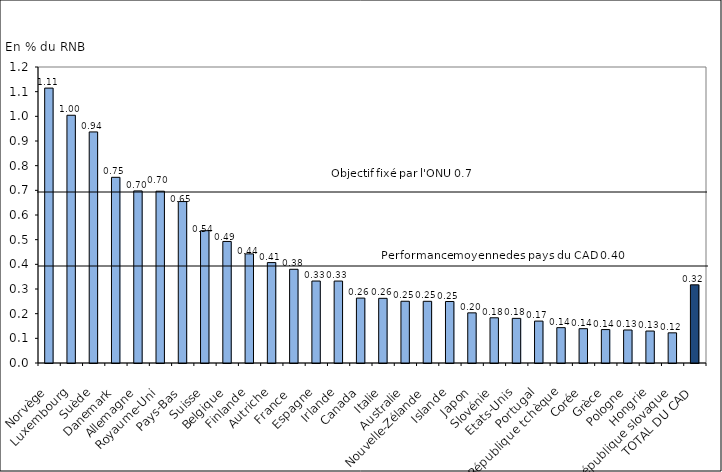
| Category | Series 0 |
|---|---|
| Norvège | 1.114 |
| Luxembourg | 1.004 |
| Suède | 0.937 |
| Danemark | 0.753 |
| Allemagne | 0.698 |
| Royaume-Uni | 0.696 |
| Pays-Bas | 0.654 |
| Suisse | 0.536 |
| Belgique | 0.493 |
| Finlande | 0.442 |
| Autriche | 0.407 |
| France  | 0.38 |
| Espagne | 0.332 |
| Irlande | 0.332 |
| Canada | 0.263 |
| Italie | 0.262 |
| Australie | 0.25 |
| Nouvelle-Zélande | 0.25 |
| Islande | 0.249 |
| Japon | 0.203 |
| Slovénie | 0.183 |
| Etats-Unis | 0.181 |
| Portugal | 0.17 |
| République tchèque | 0.143 |
| Corée | 0.139 |
| Grèce | 0.136 |
| Pologne | 0.134 |
| Hongrie | 0.13 |
| République slovaque | 0.122 |
| TOTAL DU CAD | 0.317 |